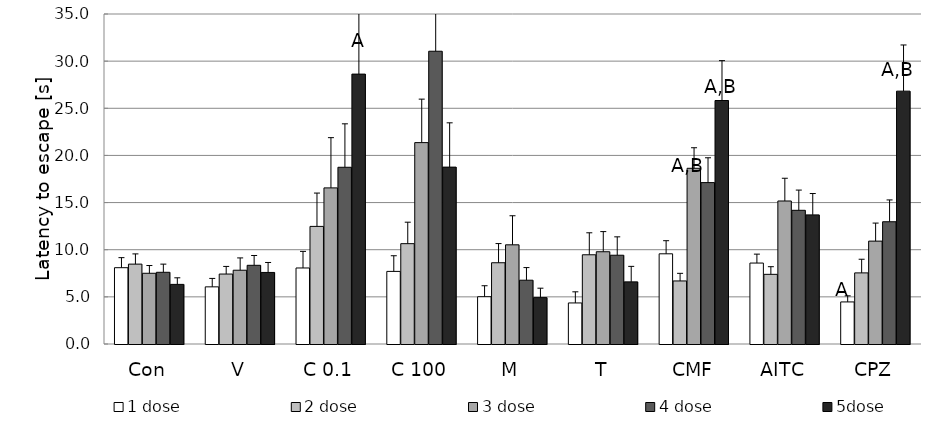
| Category | 1 dose | 2 dose | 3 dose | 4 dose | 5dose |
|---|---|---|---|---|---|
| Con | 8.093 | 8.473 | 7.502 | 7.606 | 6.323 |
| V | 6.061 | 7.42 | 7.825 | 8.346 | 7.589 |
| C 0.1 | 8.063 | 12.473 | 16.558 | 18.744 | 28.626 |
| C 100 | 7.701 | 10.641 | 21.358 | 31.051 | 18.761 |
| M | 5.015 | 8.618 | 10.519 | 6.766 | 4.919 |
| T | 4.354 | 9.463 | 9.786 | 9.415 | 6.59 |
| CMF | 9.566 | 6.688 | 18.637 | 17.118 | 25.825 |
| AITC | 8.585 | 7.389 | 15.167 | 14.18 | 13.695 |
| CPZ | 4.463 | 7.542 | 10.911 | 12.966 | 26.818 |